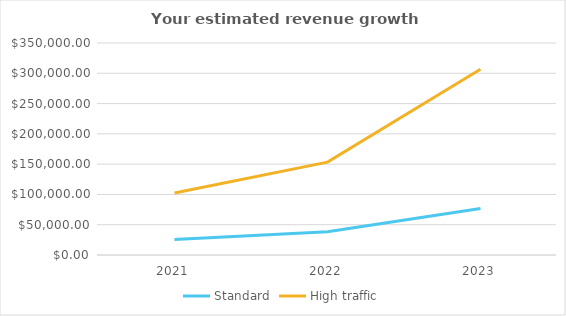
| Category | Standard |  High traffic  |
|---|---|---|
| 2021.0 | 25560 | 102240 |
| 2022.0 | 38340 | 153360 |
| 2023.0 | 76680 | 306720 |